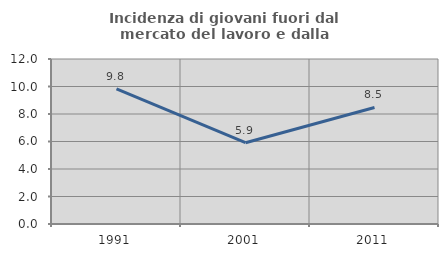
| Category | Incidenza di giovani fuori dal mercato del lavoro e dalla formazione  |
|---|---|
| 1991.0 | 9.831 |
| 2001.0 | 5.911 |
| 2011.0 | 8.478 |